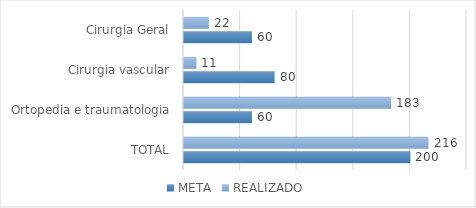
| Category | META | REALIZADO |
|---|---|---|
| TOTAL | 200 | 216 |
| Ortopedia e traumatologia | 60 | 183 |
| Cirurgia vascular | 80 | 11 |
| Cirurgia Geral | 60 | 22 |